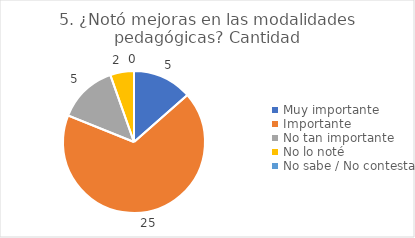
| Category | 5. ¿Notó mejoras en las modalidades pedagógicas? |
|---|---|
| Muy importante  | 0.135 |
| Importante  | 0.676 |
| No tan importante  | 0.135 |
| No lo noté  | 0.054 |
| No sabe / No contesta | 0 |